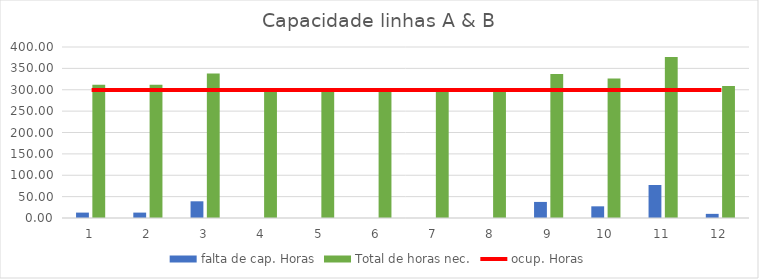
| Category | falta de cap. Horas | Total de horas nec. |
|---|---|---|
| 1.0 | 12.629 | 311.829 |
| 2.0 | 12.629 | 311.829 |
| 3.0 | 39.063 | 338.263 |
| 4.0 | 0 | 299.2 |
| 5.0 | 0 | 299.2 |
| 6.0 | 0 | 299.2 |
| 7.0 | 0 | 299.2 |
| 8.0 | 0 | 299.2 |
| 9.0 | 37.595 | 336.795 |
| 10.0 | 27.315 | 326.515 |
| 11.0 | 77.245 | 376.445 |
| 12.0 | 9.692 | 308.892 |